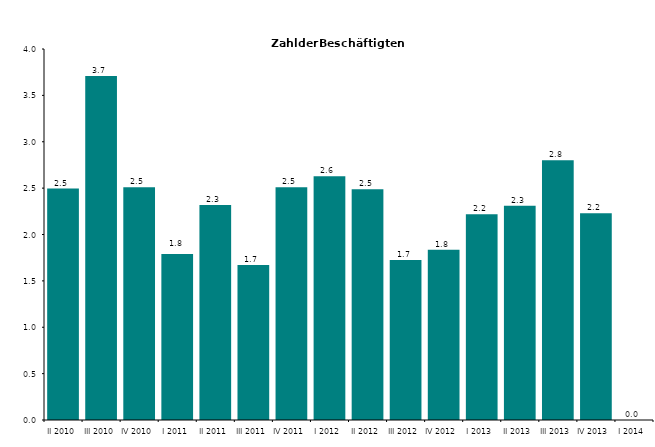
| Category | Series 0 |
|---|---|
| II 2010 | 2.495 |
| III 2010 | 3.708 |
| IV 2010 | 2.509 |
| I 2011 | 1.79 |
| II 2011 | 2.319 |
| III 2011 | 1.672 |
| IV 2011 | 2.509 |
| I 2012 | 2.627 |
| II 2012 | 2.487 |
| III 2012 | 1.724 |
| IV 2012 | 1.834 |
| I 2013 | 2.218 |
| II 2013 | 2.309 |
| III 2013 | 2.802 |
| IV 2013 | 2.23 |
| I 2014 | 0 |